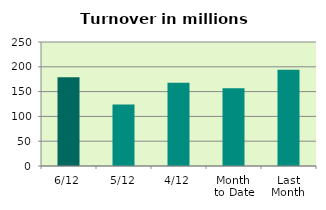
| Category | Series 0 |
|---|---|
| 6/12 | 178.825 |
| 5/12 | 123.804 |
| 4/12 | 167.839 |
| Month 
to Date | 156.79 |
| Last
Month | 193.997 |